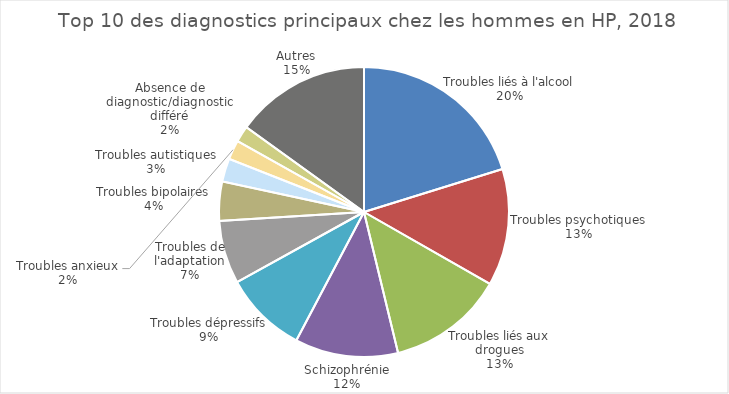
| Category | Fréquence |
|---|---|
| Troubles liés à l'alcool | 5640 |
| Troubles psychotiques | 3641 |
| Troubles liés aux drogues | 3616 |
| Schizophrénie | 3208 |
| Troubles dépressifs | 2578 |
| Troubles de l'adaptation | 1971 |
| Troubles bipolaires | 1218 |
| Troubles autistiques | 722 |
| Troubles anxieux | 604 |
| Absence de diagnostic/diagnostic différé | 503 |
| Autres | 4201 |